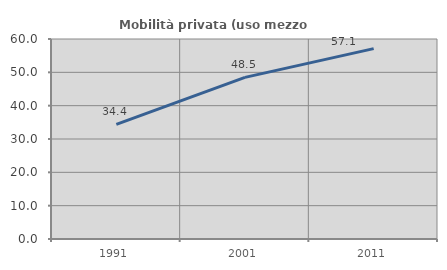
| Category | Mobilità privata (uso mezzo privato) |
|---|---|
| 1991.0 | 34.368 |
| 2001.0 | 48.485 |
| 2011.0 | 57.108 |